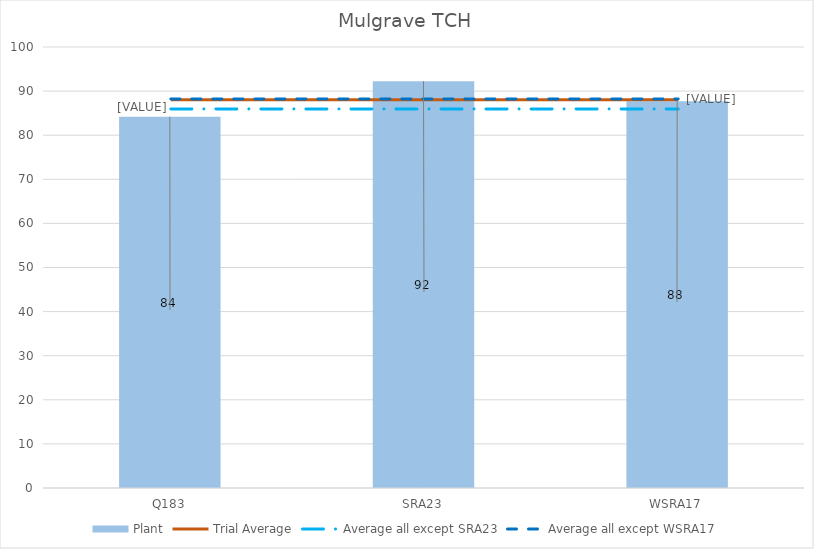
| Category | Plant |
|---|---|
| Q183 | 84.204 |
| SRA23 | 92.244 |
| WSRA17 | 87.717 |